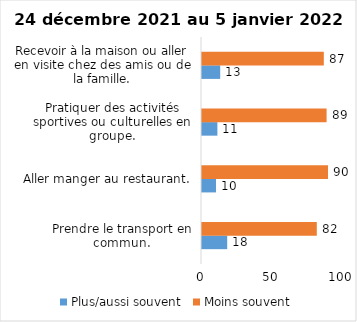
| Category | Plus/aussi souvent | Moins souvent |
|---|---|---|
| Prendre le transport en commun. | 18 | 82 |
| Aller manger au restaurant. | 10 | 90 |
| Pratiquer des activités sportives ou culturelles en groupe. | 11 | 89 |
| Recevoir à la maison ou aller en visite chez des amis ou de la famille. | 13 | 87 |